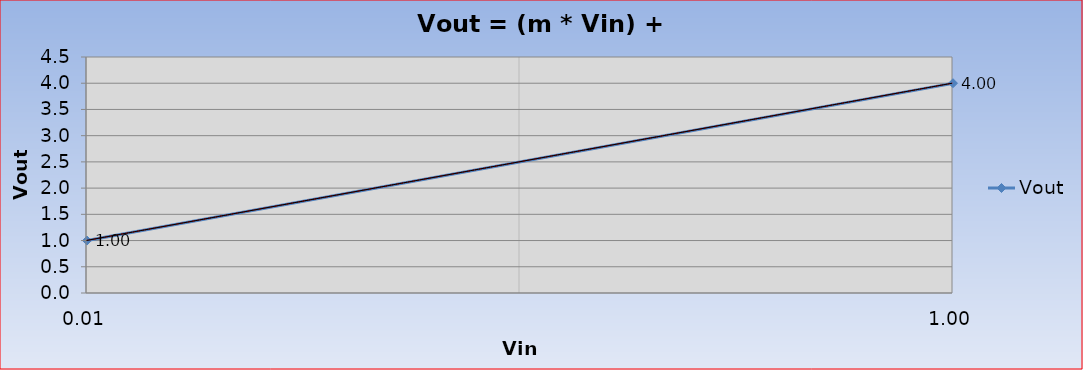
| Category | Vout |
|---|---|
| 0.01 | 1 |
| 1.0 | 4 |